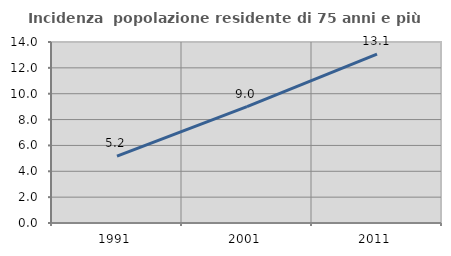
| Category | Incidenza  popolazione residente di 75 anni e più |
|---|---|
| 1991.0 | 5.17 |
| 2001.0 | 8.997 |
| 2011.0 | 13.064 |